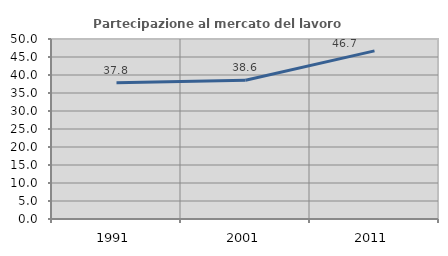
| Category | Partecipazione al mercato del lavoro  femminile |
|---|---|
| 1991.0 | 37.837 |
| 2001.0 | 38.563 |
| 2011.0 | 46.701 |